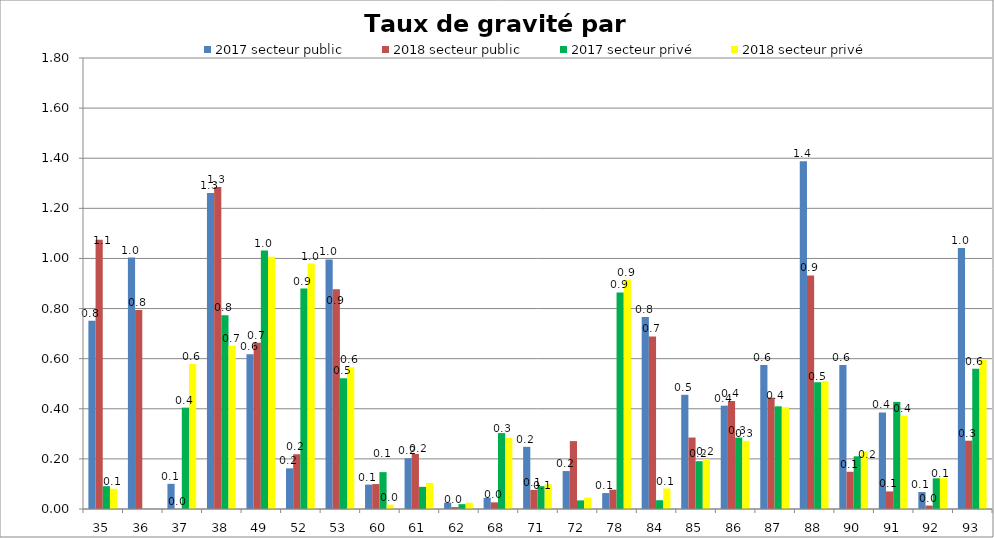
| Category | 2017 secteur public | 2018 secteur public | 2017 secteur privé | 2018 secteur privé |
|---|---|---|---|---|
| 35 | 0.751 | 1.075 | 0.091 | 0.081 |
| 36 | 1.003 | 0.794 | 0 | 0 |
| 37 | 0.1 | 0 | 0.405 | 0.579 |
| 38 | 1.261 | 1.285 | 0.773 | 0.652 |
| 49 | 0.618 | 0.664 | 1.031 | 1.007 |
| 52 | 0.162 | 0.219 | 0.88 | 0.979 |
| 53 | 0.996 | 0.877 | 0.522 | 0.566 |
| 60 | 0.097 | 0.1 | 0.147 | 0.017 |
| 61 | 0.203 | 0.22 | 0.088 | 0.104 |
| 62 | 0.025 | 0.008 | 0.019 | 0.025 |
| 68 | 0.045 | 0.027 | 0.303 | 0.284 |
| 71 | 0.248 | 0.076 | 0.091 | 0.099 |
| 72 | 0.151 | 0.271 | 0.034 | 0.046 |
| 78 | 0.064 | 0.077 | 0.865 | 0.915 |
| 84 | 0.767 | 0.689 | 0.035 | 0.082 |
| 85 | 0.456 | 0.285 | 0.191 | 0.2 |
| 86 | 0.412 | 0.431 | 0.285 | 0.272 |
| 87 | 0.574 | 0.444 | 0.41 | 0.406 |
| 88 | 1.388 | 0.932 | 0.506 | 0.51 |
| 90 | 0.575 | 0.149 | 0.21 | 0.229 |
| 91 | 0.386 | 0.07 | 0.428 | 0.372 |
| 92 | 0.068 | 0.014 | 0.123 | 0.123 |
| 93 | 1.042 | 0.273 | 0.56 | 0.595 |